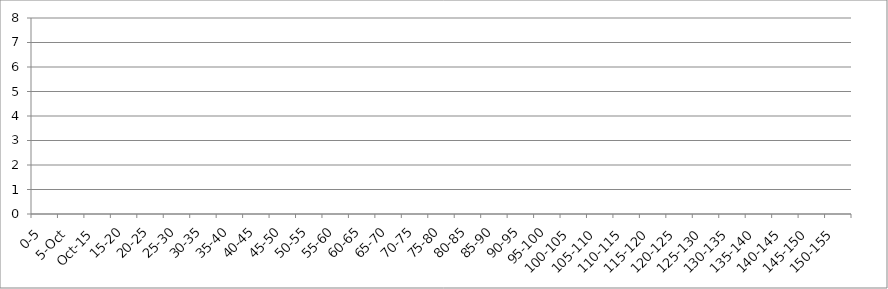
| Category | UNION_ALL | INTERSECTION_ALL | UNION(INTERSECTION_119875_146067,INTERSECTION_119875_241240,INTERSECTION_146067_241240) |
|---|---|---|---|
| 0-5 | 0 | 0 | 0 |
| 5-Oct | 0 | 0 | 0 |
| Oct-15 | 0 | 0 | 0 |
| 15-20 | 0 | 0 | 0 |
| 20-25 | 0 | 0 | 0 |
| 25-30 | 0 | 0 | 0 |
| 30-35 | 0 | 0 | 0 |
| 35-40 | 0 | 0 | 0 |
| 40-45 | 0 | 0 | 0 |
| 45-50 | 0 | 0 | 0 |
| 50-55 | 0 | 0 | 0 |
| 55-60 | 0 | 0 | 0 |
| 60-65 | 0 | 0 | 0 |
| 65-70 | 0 | 0 | 0 |
| 70-75 | 0 | 0 | 0 |
| 75-80 | 0 | 0 | 0 |
| 80-85 | 0 | 0 | 0 |
| 85-90 | 0 | 0 | 0 |
| 90-95 | 0 | 0 | 0 |
| 95-100 | 0 | 0 | 0 |
| 100-105 | 0 | 0 | 0 |
| 105-110 | 0 | 0 | 0 |
| 110-115 | 0 | 0 | 0 |
| 115-120 | 0 | 0 | 0 |
| 120-125 | 0 | 0 | 0 |
| 125-130 | 0 | 0 | 0 |
| 130-135 | 0 | 0 | 0 |
| 135-140 | 0 | 0 | 0 |
| 140-145 | 0 | 0 | 0 |
| 145-150 | 0 | 0 | 0 |
| 150-155 | 0 | 0 | 0 |